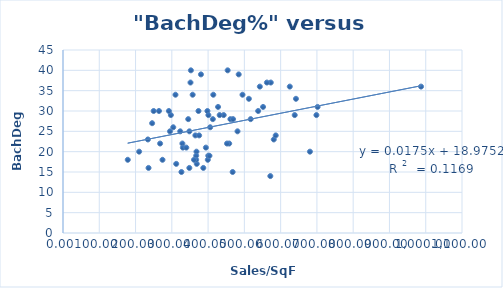
| Category | BachDeg% |
|---|---|
| 701.97 | 31 |
| 209.93 | 20 |
| 364.92 | 24 |
| 443.04 | 29 |
| 399.2 | 18 |
| 264.64 | 30 |
| 571.59 | 14 |
| 642.25 | 33 |
| 461.45 | 28 |
| 638.82 | 29 |
| 484.38 | 39 |
| 581.09 | 23 |
| 267.71 | 22 |
| 572.84 | 37 |
| 586.48 | 24 |
| 368.73 | 17 |
| 351.47 | 37 |
| 458.24 | 22 |
| 987.12 | 36 |
| 357.45 | 34 |
| 405.77 | 26 |
| 680.8 | 20 |
| 368.02 | 20 |
| 303.95 | 26 |
| 393.9 | 21 |
| 562.12 | 37 |
| 494.88 | 34 |
| 310.07 | 34 |
| 373.46 | 30 |
| 235.81 | 16 |
| 413.08 | 28 |
| 625.22 | 36 |
| 274.3 | 18 |
| 542.62 | 36 |
| 178.56 | 18 |
| 375.33 | 24 |
| 329.09 | 22 |
| 297.37 | 29 |
| 323.17 | 25 |
| 468.84 | 28 |
| 352.57 | 40 |
| 380.34 | 39 |
| 398.12 | 30 |
| 312.15 | 17 |
| 452.16 | 22 |
| 698.64 | 29 |
| 367.19 | 19 |
| 431.93 | 29 |
| 367.06 | 18 |
| 400.53 | 19 |
| 414.36 | 34 |
| 481.11 | 25 |
| 538.06 | 30 |
| 330.48 | 21 |
| 249.93 | 30 |
| 291.87 | 30 |
| 517.4 | 28 |
| 551.58 | 31 |
| 386.81 | 16 |
| 427.5 | 31 |
| 453.94 | 40 |
| 512.46 | 33 |
| 345.27 | 28 |
| 234.04 | 23 |
| 348.33 | 16 |
| 348.47 | 25 |
| 294.95 | 25 |
| 361.14 | 18 |
| 467.71 | 15 |
| 403.78 | 19 |
| 245.74 | 27 |
| 339.94 | 21 |
| 400.82 | 29 |
| 326.54 | 15 |